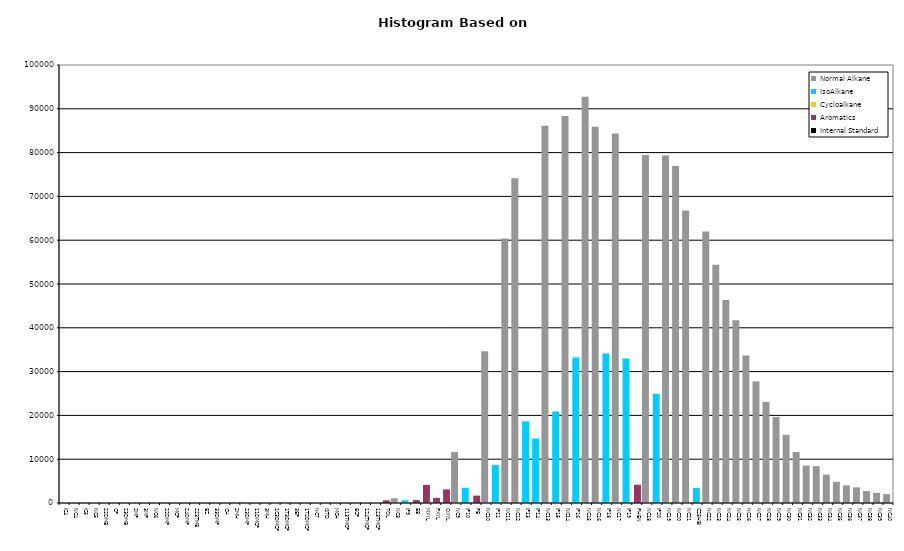
| Category | Normal Alkane | IsoAlkane | Cycloalkane | Aromatics | Internal Standard |
|---|---|---|---|---|---|
| IC4 | 0 | 0 | 0 | 0 | 0 |
| NC4 | 0 | 0 | 0 | 0 | 0 |
| IC5 | 0 | 0 | 0 | 0 | 0 |
| NC5 | 0 | 0 | 0 | 0 | 0 |
| 22DMB | 0 | 0 | 0 | 0 | 0 |
| CP | 0 | 0 | 0 | 0 | 0 |
| 23DMB | 0 | 0 | 0 | 0 | 0 |
| 2MP | 0 | 0 | 0 | 0 | 0 |
| 3MP | 0 | 0 | 0 | 0 | 0 |
| NC6 | 0 | 0 | 0 | 0 | 0 |
| 22DMP | 0 | 0 | 0 | 0 | 0 |
| MCP | 0 | 0 | 0 | 0 | 0 |
| 24DMP | 0 | 0 | 0 | 0 | 0 |
| 223TMB | 0 | 0 | 0 | 0 | 0 |
| BZ | 0 | 0 | 0 | 0 | 0 |
| 33DMP | 0 | 0 | 0 | 0 | 0 |
| CH | 0 | 0 | 0 | 0 | 0 |
| 2MH | 0 | 0 | 0 | 0 | 0 |
| 23DMP | 0 | 0 | 0 | 0 | 0 |
| 11DMCP | 0 | 0 | 0 | 0 | 0 |
| 3MH | 0 | 0 | 0 | 0 | 0 |
| 1C3DMCP | 0 | 0 | 0 | 0 | 0 |
| 1T3DMCP | 0 | 0 | 0 | 0 | 0 |
| 3EP | 0 | 0 | 0 | 0 | 0 |
| 1T2DMCP | 0 | 0 | 0 | 0 | 0 |
| NC7 | 0 | 0 | 0 | 0 | 0 |
| ISTD | 0 | 0 | 0 | 0 | 0 |
| MCH | 0 | 0 | 60 | 0 | 0 |
| 113TMCP | 0 | 0 | 0 | 0 | 0 |
| ECP | 0 | 0 | 0 | 0 | 0 |
| 124TMCP | 0 | 0 | 0 | 0 | 0 |
| 123TMCP | 0 | 0 | 0 | 0 | 0 |
| TOL | 0 | 0 | 0 | 620 | 0 |
| NC8 | 1084 | 0 | 0 | 0 | 0 |
| IP9 | 0 | 627 | 0 | 0 | 0 |
| EB | 0 | 0 | 0 | 665 | 0 |
| MXYL | 0 | 0 | 0 | 4112 | 0 |
| PXYL | 0 | 0 | 0 | 1169 | 0 |
| OXYL | 0 | 0 | 0 | 3102 | 0 |
| NC9 | 11620 | 0 | 0 | 0 | 0 |
| IP10 | 0 | 3475 | 0 | 0 | 0 |
| PB | 0 | 0 | 0 | 1684 | 0 |
| NC10 | 34626 | 0 | 0 | 0 | 0 |
| IP11 | 0 | 8659 | 0 | 0 | 0 |
| NC11 | 60387 | 0 | 0 | 0 | 0 |
| NC12 | 74117 | 0 | 0 | 0 | 0 |
| IP13 | 0 | 18632 | 0 | 0 | 0 |
| IP14 | 0 | 14719 | 0 | 0 | 0 |
| NC13 | 86114 | 0 | 0 | 0 | 0 |
| IP15 | 0 | 20905 | 0 | 0 | 0 |
| NC14 | 88338 | 0 | 0 | 0 | 0 |
| IP16 | 0 | 33219 | 0 | 0 | 0 |
| NC15 | 92755 | 0 | 0 | 0 | 0 |
| NC16 | 85913 | 0 | 0 | 0 | 0 |
| IP18 | 0 | 34149 | 0 | 0 | 0 |
| NC17 | 84386 | 0 | 0 | 0 | 0 |
| IP19 | 0 | 32969 | 0 | 0 | 0 |
| PHEN | 0 | 0 | 0 | 4165 | 0 |
| NC18 | 79476 | 0 | 0 | 0 | 0 |
| IP20 | 0 | 24885 | 0 | 0 | 0 |
| NC19 | 79317 | 0 | 0 | 0 | 0 |
| NC20 | 76913 | 0 | 0 | 0 | 0 |
| NC21 | 66756 | 0 | 0 | 0 | 0 |
| C25HBI | 0 | 3403 | 0 | 0 | 0 |
| NC22 | 61985 | 0 | 0 | 0 | 0 |
| NC23 | 54379 | 0 | 0 | 0 | 0 |
| NC24 | 46370 | 0 | 0 | 0 | 0 |
| NC25 | 41702 | 0 | 0 | 0 | 0 |
| NC26 | 33672 | 0 | 0 | 0 | 0 |
| NC27 | 27767 | 0 | 0 | 0 | 0 |
| NC28 | 23088 | 0 | 0 | 0 | 0 |
| NC29 | 19651 | 0 | 0 | 0 | 0 |
| NC30 | 15562 | 0 | 0 | 0 | 0 |
| NC31 | 11661 | 0 | 0 | 0 | 0 |
| NC32 | 8541 | 0 | 0 | 0 | 0 |
| NC33 | 8415 | 0 | 0 | 0 | 0 |
| NC34 | 6478 | 0 | 0 | 0 | 0 |
| NC35 | 4833 | 0 | 0 | 0 | 0 |
| NC36 | 4019 | 0 | 0 | 0 | 0 |
| NC37 | 3576 | 0 | 0 | 0 | 0 |
| NC38 | 2721 | 0 | 0 | 0 | 0 |
| NC39 | 2307 | 0 | 0 | 0 | 0 |
| NC40 | 2020 | 0 | 0 | 0 | 0 |